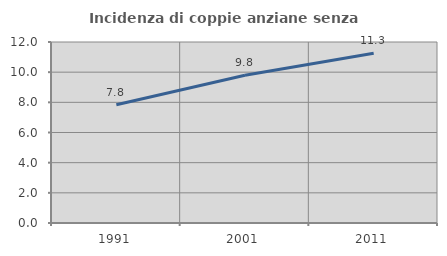
| Category | Incidenza di coppie anziane senza figli  |
|---|---|
| 1991.0 | 7.841 |
| 2001.0 | 9.79 |
| 2011.0 | 11.257 |